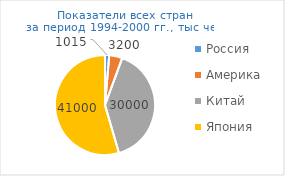
| Category | Series 0 |
|---|---|
| Россия | 1015 |
| Америка | 3200 |
| Китай | 30000 |
| Япония | 41000 |